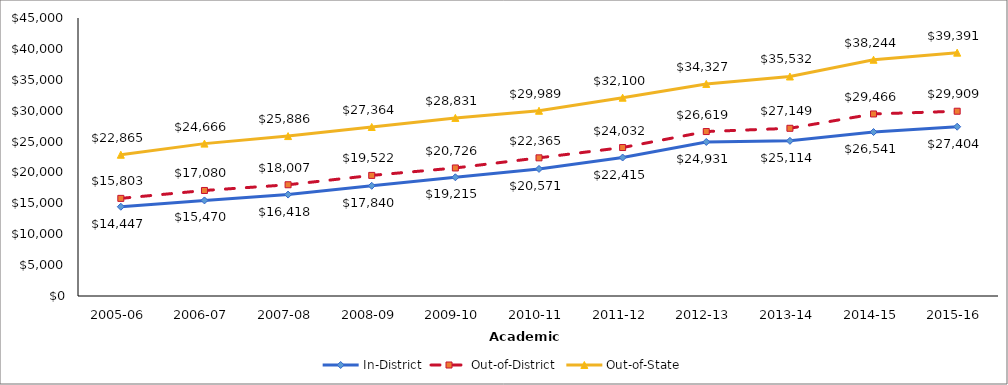
| Category | In-District | Out-of-District | Out-of-State |
|---|---|---|---|
| 2005-06 | 14447 | 15803 | 22865 |
| 2006-07 | 15470 | 17080 | 24666 |
| 2007-08 | 16418 | 18007 | 25886 |
| 2008-09 | 17839.697 | 19521.65 | 27363.58 |
| 2009-10 | 19215 | 20726 | 28831 |
| 2010-11 | 20571 | 22365 | 29989 |
| 2011-12 | 22415 | 24032 | 32100 |
| 2012-13 | 24931 | 26619 | 34327 |
| 2013-14 | 25114.27 | 27148.6 | 35532.25 |
| 2014-15 | 26541.34 | 29465.87 | 38243.8 |
| 2015-16 | 27404 | 29909 | 39391 |